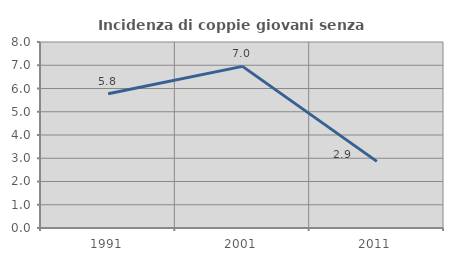
| Category | Incidenza di coppie giovani senza figli |
|---|---|
| 1991.0 | 5.773 |
| 2001.0 | 6.951 |
| 2011.0 | 2.865 |